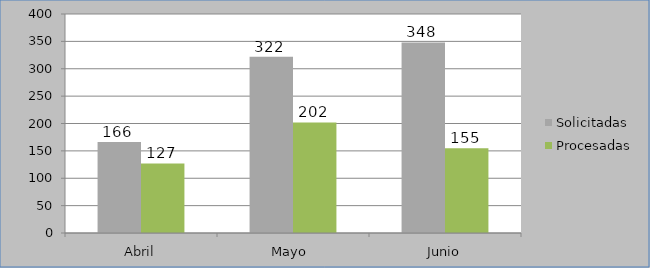
| Category | Solicitadas | Procesadas |
|---|---|---|
| Abril | 166 | 127 |
| Mayo  | 322 | 202 |
| Junio | 348 | 155 |